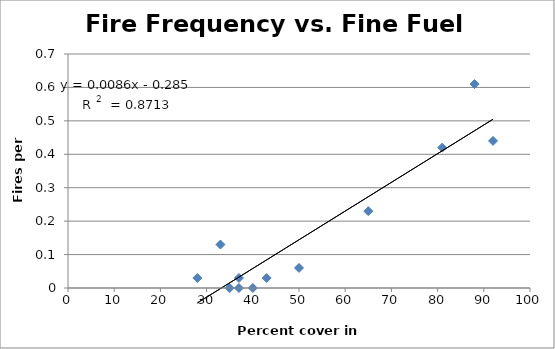
| Category | Fire Frequency vs. Fine Fuel Frequency |
|---|---|
| 40.0 | 0 |
| 37.0 | 0 |
| 35.0 | 0 |
| 43.0 | 0.03 |
| 37.0 | 0.03 |
| 28.0 | 0.03 |
| 50.0 | 0.06 |
| 33.0 | 0.13 |
| 65.0 | 0.23 |
| 81.0 | 0.42 |
| 92.0 | 0.44 |
| 88.0 | 0.61 |